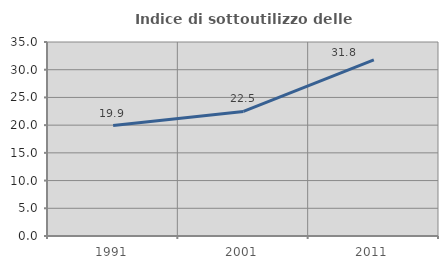
| Category | Indice di sottoutilizzo delle abitazioni  |
|---|---|
| 1991.0 | 19.915 |
| 2001.0 | 22.469 |
| 2011.0 | 31.792 |